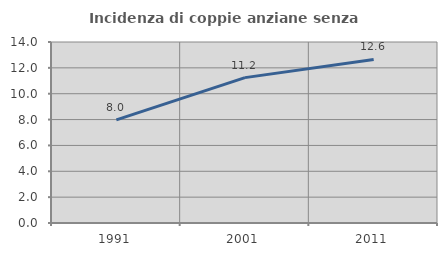
| Category | Incidenza di coppie anziane senza figli  |
|---|---|
| 1991.0 | 7.98 |
| 2001.0 | 11.244 |
| 2011.0 | 12.648 |